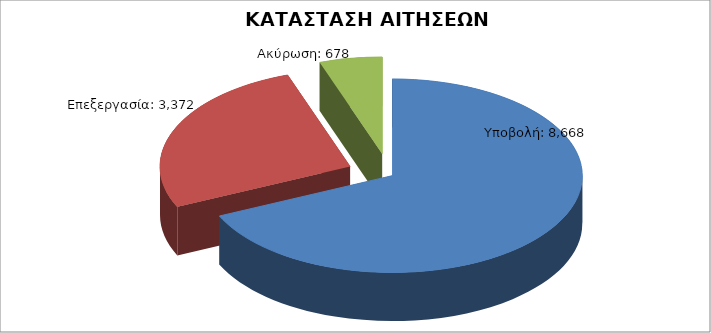
| Category | Series 0 |
|---|---|
| Υποβολή: | 8668 |
| Επεξεργασία: | 3372 |
| Ακύρωση: | 678 |